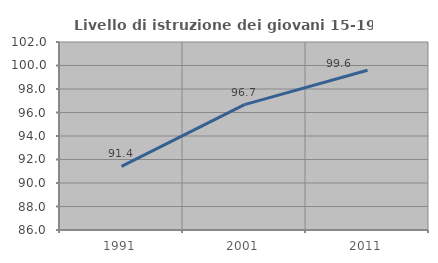
| Category | Livello di istruzione dei giovani 15-19 anni |
|---|---|
| 1991.0 | 91.408 |
| 2001.0 | 96.667 |
| 2011.0 | 99.593 |